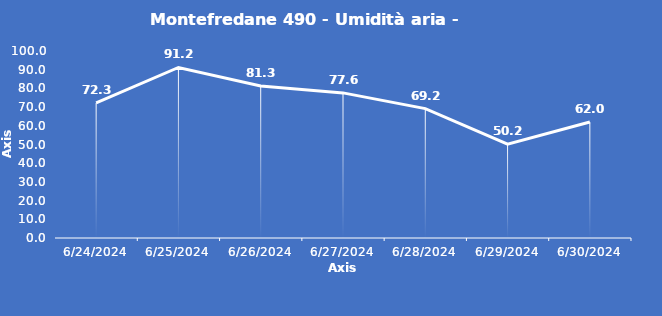
| Category | Montefredane 490 - Umidità aria - Grezzo (%) |
|---|---|
| 6/24/24 | 72.3 |
| 6/25/24 | 91.2 |
| 6/26/24 | 81.3 |
| 6/27/24 | 77.6 |
| 6/28/24 | 69.2 |
| 6/29/24 | 50.2 |
| 6/30/24 | 62 |